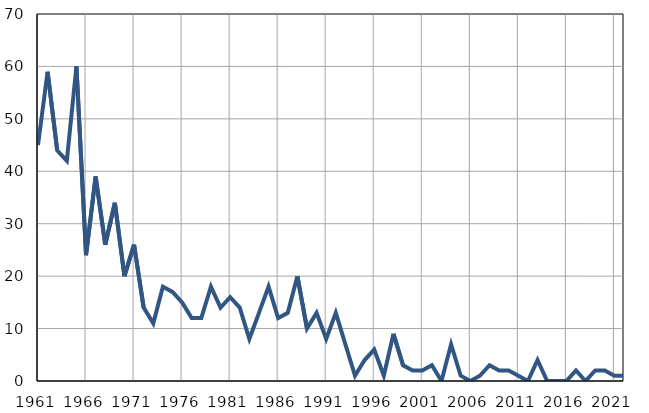
| Category | Infants
deaths |
|---|---|
| 1961.0 | 45 |
| 1962.0 | 59 |
| 1963.0 | 44 |
| 1964.0 | 42 |
| 1965.0 | 60 |
| 1966.0 | 24 |
| 1967.0 | 39 |
| 1968.0 | 26 |
| 1969.0 | 34 |
| 1970.0 | 20 |
| 1971.0 | 26 |
| 1972.0 | 14 |
| 1973.0 | 11 |
| 1974.0 | 18 |
| 1975.0 | 17 |
| 1976.0 | 15 |
| 1977.0 | 12 |
| 1978.0 | 12 |
| 1979.0 | 18 |
| 1980.0 | 14 |
| 1981.0 | 16 |
| 1982.0 | 14 |
| 1983.0 | 8 |
| 1984.0 | 13 |
| 1985.0 | 18 |
| 1986.0 | 12 |
| 1987.0 | 13 |
| 1988.0 | 20 |
| 1989.0 | 10 |
| 1990.0 | 13 |
| 1991.0 | 8 |
| 1992.0 | 13 |
| 1993.0 | 7 |
| 1994.0 | 1 |
| 1995.0 | 4 |
| 1996.0 | 6 |
| 1997.0 | 1 |
| 1998.0 | 9 |
| 1999.0 | 3 |
| 2000.0 | 2 |
| 2001.0 | 2 |
| 2002.0 | 3 |
| 2003.0 | 0 |
| 2004.0 | 7 |
| 2005.0 | 1 |
| 2006.0 | 0 |
| 2007.0 | 1 |
| 2008.0 | 3 |
| 2009.0 | 2 |
| 2010.0 | 2 |
| 2011.0 | 1 |
| 2012.0 | 0 |
| 2013.0 | 4 |
| 2014.0 | 0 |
| 2015.0 | 0 |
| 2016.0 | 0 |
| 2017.0 | 2 |
| 2018.0 | 0 |
| 2019.0 | 2 |
| 2020.0 | 2 |
| 2021.0 | 1 |
| 2022.0 | 1 |